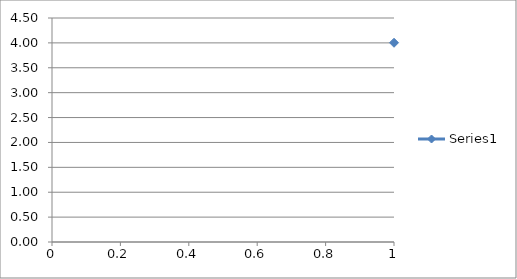
| Category | Series 0 |
|---|---|
| 0 | 4.003 |
| 1 | 3.803 |
| 2 | 3.603 |
| 3 | 3.403 |
| 4 | 3.202 |
| 5 | 3.003 |
| 6 | 2.802 |
| 7 | 2.602 |
| 8 | 2.402 |
| 9 | 2.202 |
| 10 | 2.002 |
| 11 | 1.802 |
| 12 | 1.602 |
| 13 | 1.401 |
| 14 | 1.202 |
| 15 | 1.002 |
| 16 | 0.801 |
| 17 | 0.601 |
| 18 | 0.401 |
| 19 | 0.201 |
| 20 | 0 |